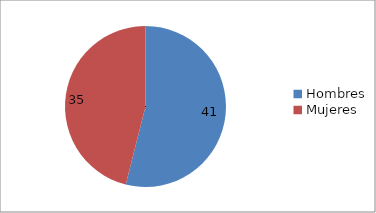
| Category | Series 0 |
|---|---|
| Hombres | 41 |
| Mujeres | 35 |